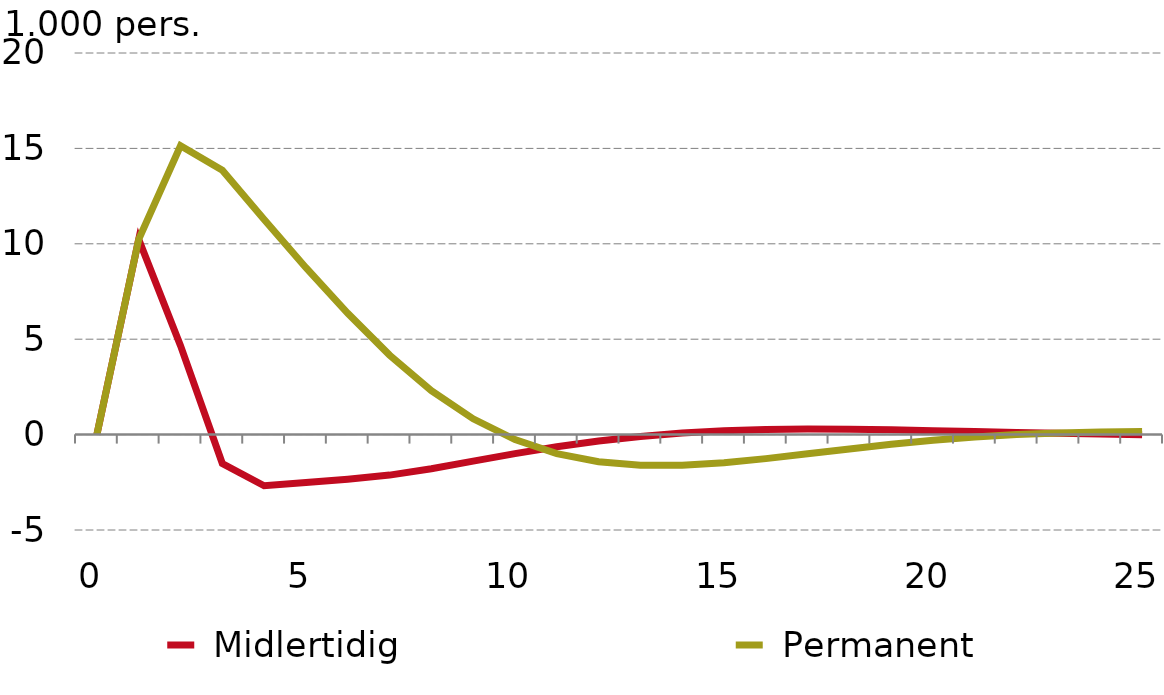
| Category |  Midlertidig |  Permanent |
|---|---|---|
| 0.0 | 0 | 0 |
| nan | 10.229 | 10.229 |
| nan | 4.664 | 15.138 |
| nan | -1.513 | 13.856 |
| nan | -2.68 | 11.268 |
| 5.0 | -2.509 | 8.747 |
| nan | -2.34 | 6.357 |
| nan | -2.123 | 4.169 |
| nan | -1.789 | 2.305 |
| nan | -1.393 | 0.827 |
| 10.0 | -0.998 | -0.262 |
| nan | -0.639 | -0.995 |
| nan | -0.335 | -1.423 |
| nan | -0.095 | -1.606 |
| nan | 0.082 | -1.603 |
| 15.0 | 0.199 | -1.47 |
| nan | 0.264 | -1.258 |
| nan | 0.287 | -1.008 |
| nan | 0.279 | -0.751 |
| nan | 0.249 | -0.51 |
| 20.0 | 0.206 | -0.301 |
| nan | 0.158 | -0.13 |
| nan | 0.109 | -0.001 |
| nan | 0.065 | 0.088 |
| nan | 0.028 | 0.141 |
| 25.0 | -0.002 | 0.165 |